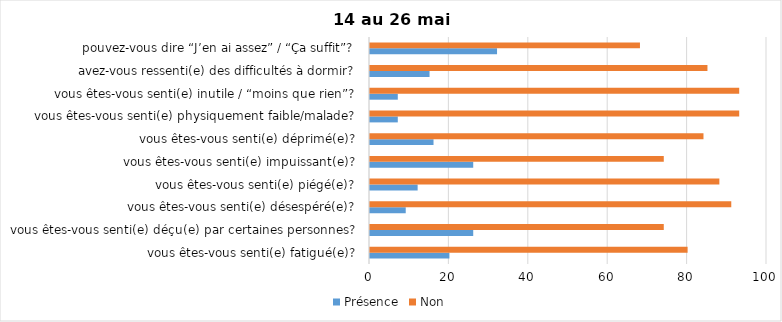
| Category | Présence | Non |
|---|---|---|
| vous êtes-vous senti(e) fatigué(e)? | 20 | 80 |
| vous êtes-vous senti(e) déçu(e) par certaines personnes? | 26 | 74 |
| vous êtes-vous senti(e) désespéré(e)? | 9 | 91 |
| vous êtes-vous senti(e) piégé(e)? | 12 | 88 |
| vous êtes-vous senti(e) impuissant(e)? | 26 | 74 |
| vous êtes-vous senti(e) déprimé(e)? | 16 | 84 |
| vous êtes-vous senti(e) physiquement faible/malade? | 7 | 93 |
| vous êtes-vous senti(e) inutile / “moins que rien”? | 7 | 93 |
| avez-vous ressenti(e) des difficultés à dormir? | 15 | 85 |
| pouvez-vous dire “J’en ai assez” / “Ça suffit”? | 32 | 68 |